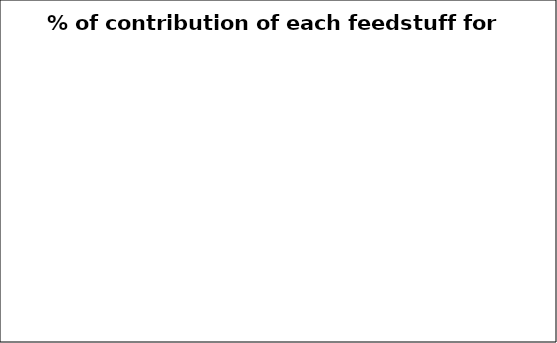
| Category | % of contribution off each feedstuff for Lysine |
|---|---|
| 0.0 | 0 |
| 0.0 | 0 |
| 0.0 | 0 |
| 0.0 | 0 |
| 0.0 | 0 |
| 0.0 | 0 |
| 0.0 | 0 |
| 0.0 | 0 |
| 0.0 | 0 |
| 0.0 | 0 |
| 0.0 | 0 |
| 0.0 | 0 |